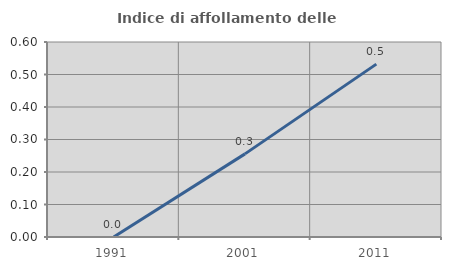
| Category | Indice di affollamento delle abitazioni  |
|---|---|
| 1991.0 | 0 |
| 2001.0 | 0.256 |
| 2011.0 | 0.532 |